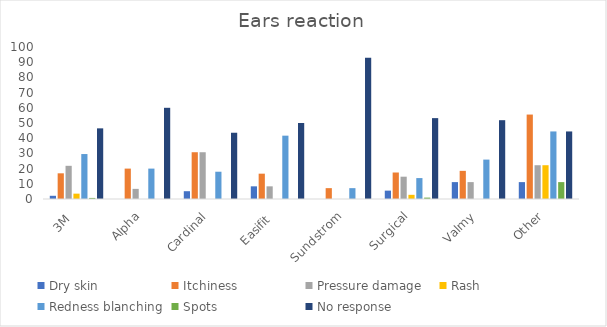
| Category | Dry skin | Itchiness | Pressure damage | Rash | Redness blanching | Spots | No response |
|---|---|---|---|---|---|---|---|
| 3M  | 2.113 | 16.901 | 21.831 | 3.521 | 29.577 | 0.704 | 46.479 |
| Alpha | 0 | 20 | 6.667 | 0 | 20 | 0 | 60 |
| Cardinal | 5.128 | 30.769 | 30.769 | 0 | 17.949 | 0 | 43.59 |
| Easifit  | 8.333 | 16.667 | 8.333 | 0 | 41.667 | 0 | 50 |
| Sundstrom | 0 | 7.143 | 0 | 0 | 7.143 | 0 | 92.857 |
| Surgical | 5.505 | 17.431 | 14.679 | 2.752 | 13.761 | 0.917 | 53.211 |
| Valmy | 11.111 | 18.519 | 11.111 | 0 | 25.926 | 0 | 51.852 |
| Other | 11.111 | 55.556 | 22.222 | 22.222 | 44.444 | 11.111 | 44.444 |